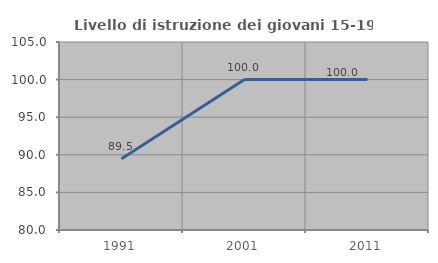
| Category | Livello di istruzione dei giovani 15-19 anni |
|---|---|
| 1991.0 | 89.474 |
| 2001.0 | 100 |
| 2011.0 | 100 |